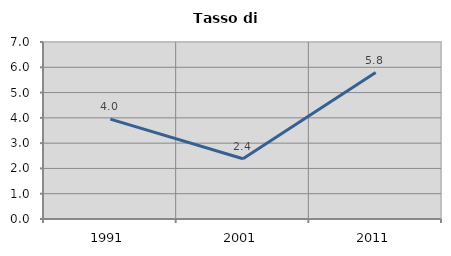
| Category | Tasso di disoccupazione   |
|---|---|
| 1991.0 | 3.951 |
| 2001.0 | 2.381 |
| 2011.0 | 5.792 |